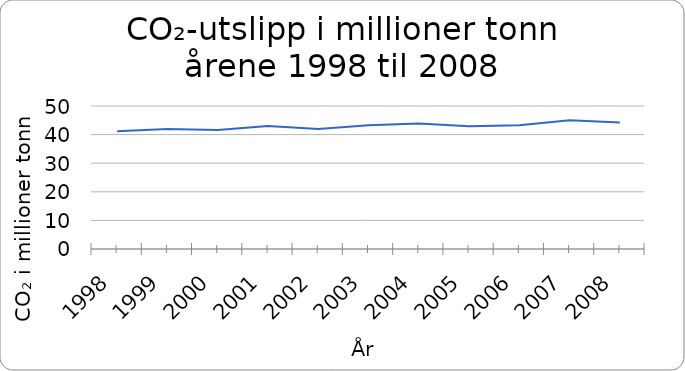
| Category | CO₂ i millioner tonn |
|---|---|
| 1998.0 | 41.2 |
| 1999.0 | 42 |
| 2000.0 | 41.6 |
| 2001.0 | 43 |
| 2002.0 | 42 |
| 2003.0 | 43.3 |
| 2004.0 | 43.9 |
| 2005.0 | 42.9 |
| 2006.0 | 43.3 |
| 2007.0 | 45 |
| 2008.0 | 44.2 |